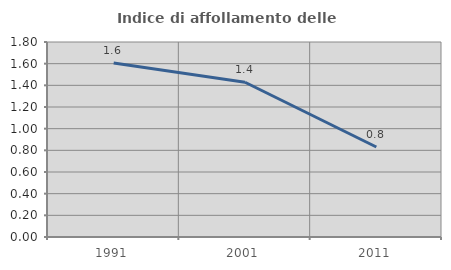
| Category | Indice di affollamento delle abitazioni  |
|---|---|
| 1991.0 | 1.606 |
| 2001.0 | 1.429 |
| 2011.0 | 0.831 |